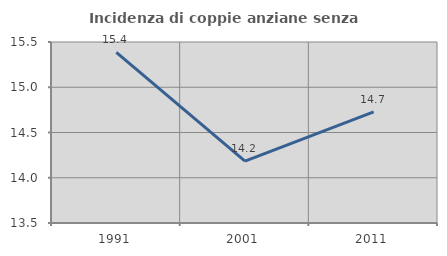
| Category | Incidenza di coppie anziane senza figli  |
|---|---|
| 1991.0 | 15.385 |
| 2001.0 | 14.184 |
| 2011.0 | 14.729 |